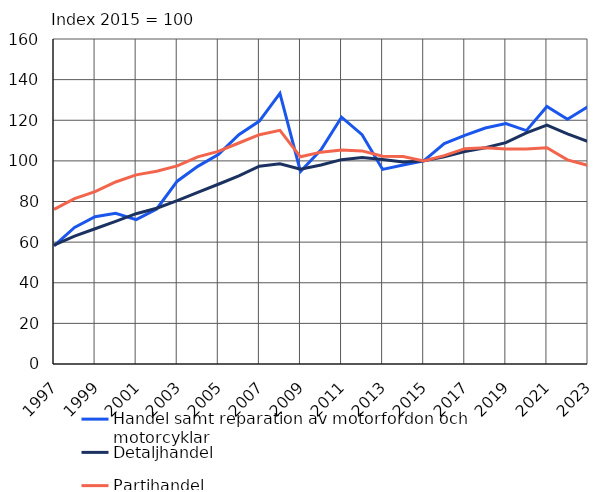
| Category | Handel samt reparation av motorfordon och motorcyklar | Detaljhandel | Partihandel |
|---|---|---|---|
| 1997.0 | 58.2 | 58.5 | 76.1 |
| 1998.0 | 67.2 | 63 | 81.4 |
| 1999.0 | 72.5 | 66.6 | 84.9 |
| 2000.0 | 74.2 | 70.2 | 89.6 |
| 2001.0 | 71.1 | 74 | 93.1 |
| 2002.0 | 76.3 | 76.7 | 94.9 |
| 2003.0 | 90 | 80.4 | 97.5 |
| 2004.0 | 97.3 | 84.5 | 102 |
| 2005.0 | 103.1 | 88.5 | 104.7 |
| 2006.0 | 112.9 | 92.6 | 108.8 |
| 2007.0 | 119.6 | 97.4 | 112.9 |
| 2008.0 | 133.2 | 98.6 | 115 |
| 2009.0 | 94.8 | 95.9 | 102 |
| 2010.0 | 105.5 | 98 | 104.3 |
| 2011.0 | 121.5 | 100.6 | 105.3 |
| 2012.0 | 112.9 | 101.7 | 104.9 |
| 2013.0 | 95.8 | 100.7 | 102.3 |
| 2014.0 | 98 | 99.5 | 102.1 |
| 2015.0 | 100 | 100 | 100 |
| 2016.0 | 108.5 | 102 | 102.6 |
| 2017.0 | 112.6 | 104.6 | 106 |
| 2018.0 | 116.2 | 106.5 | 106.4 |
| 2019.0 | 118.4 | 109 | 105.8 |
| 2020.0 | 114.9 | 113.8 | 105.9 |
| 2021.0 | 126.8 | 117.6 | 106.5 |
| 2022.0 | 120.5 | 113.3 | 100.5 |
| 2023.0 | 126.7 | 109.5 | 97.8 |